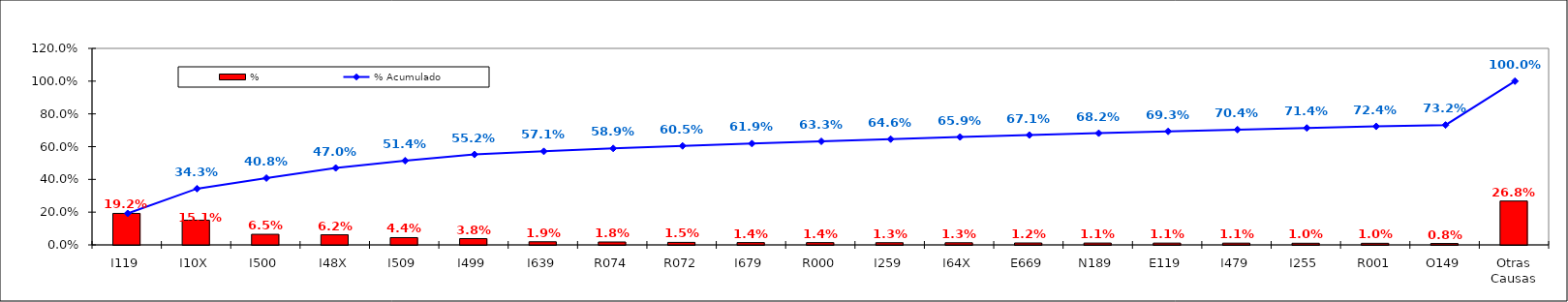
| Category | % |
|---|---|
| I119 | 0.192 |
| I10X | 0.151 |
| I500 | 0.065 |
| I48X | 0.062 |
| I509 | 0.044 |
| I499 | 0.038 |
| I639 | 0.019 |
| R074 | 0.018 |
| R072 | 0.015 |
| I679 | 0.014 |
| R000 | 0.014 |
| I259 | 0.013 |
| I64X | 0.013 |
| E669 | 0.012 |
| N189 | 0.011 |
| E119 | 0.011 |
| I479 | 0.011 |
| I255 | 0.01 |
| R001 | 0.01 |
| O149 | 0.008 |
| Otras Causas | 0.268 |